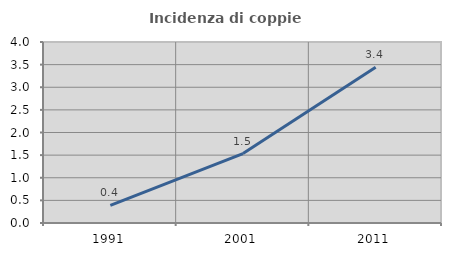
| Category | Incidenza di coppie miste |
|---|---|
| 1991.0 | 0.391 |
| 2001.0 | 1.534 |
| 2011.0 | 3.44 |